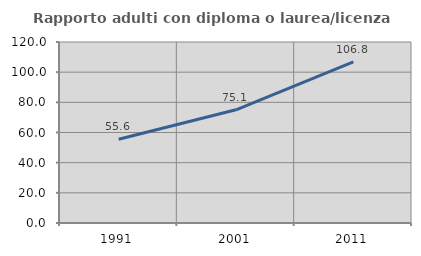
| Category | Rapporto adulti con diploma o laurea/licenza media  |
|---|---|
| 1991.0 | 55.556 |
| 2001.0 | 75.053 |
| 2011.0 | 106.809 |